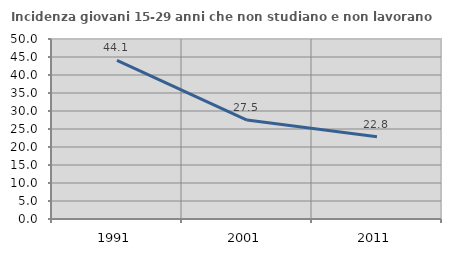
| Category | Incidenza giovani 15-29 anni che non studiano e non lavorano  |
|---|---|
| 1991.0 | 44.092 |
| 2001.0 | 27.473 |
| 2011.0 | 22.819 |